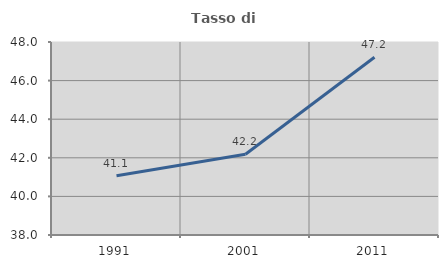
| Category | Tasso di occupazione   |
|---|---|
| 1991.0 | 41.074 |
| 2001.0 | 42.181 |
| 2011.0 | 47.21 |